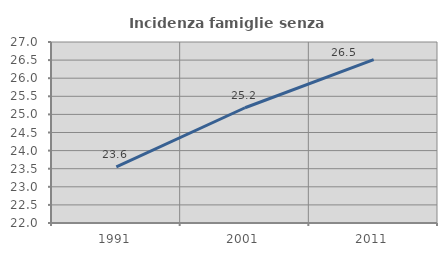
| Category | Incidenza famiglie senza nuclei |
|---|---|
| 1991.0 | 23.553 |
| 2001.0 | 25.184 |
| 2011.0 | 26.513 |